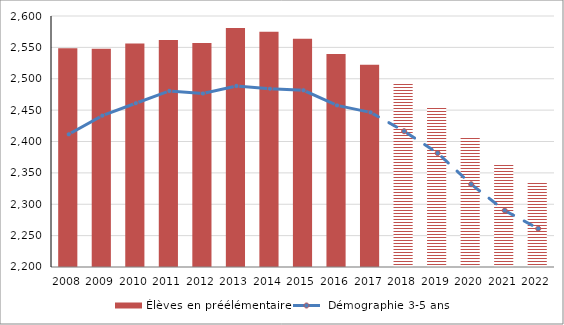
| Category | Élèves en préélémentaire |
|---|---|
| 2008.0 | 2548.8 |
| 2009.0 | 2547.9 |
| 2010.0 | 2556.1 |
| 2011.0 | 2561.8 |
| 2012.0 | 2557 |
| 2013.0 | 2580.9 |
| 2014.0 | 2574.9 |
| 2015.0 | 2563.6 |
| 2016.0 | 2539.5 |
| 2017.0 | 2522.3 |
| 2018.0 | 2492.4 |
| 2019.0 | 2456.2 |
| 2020.0 | 2405.6 |
| 2021.0 | 2363.6 |
| 2022.0 | 2334.6 |